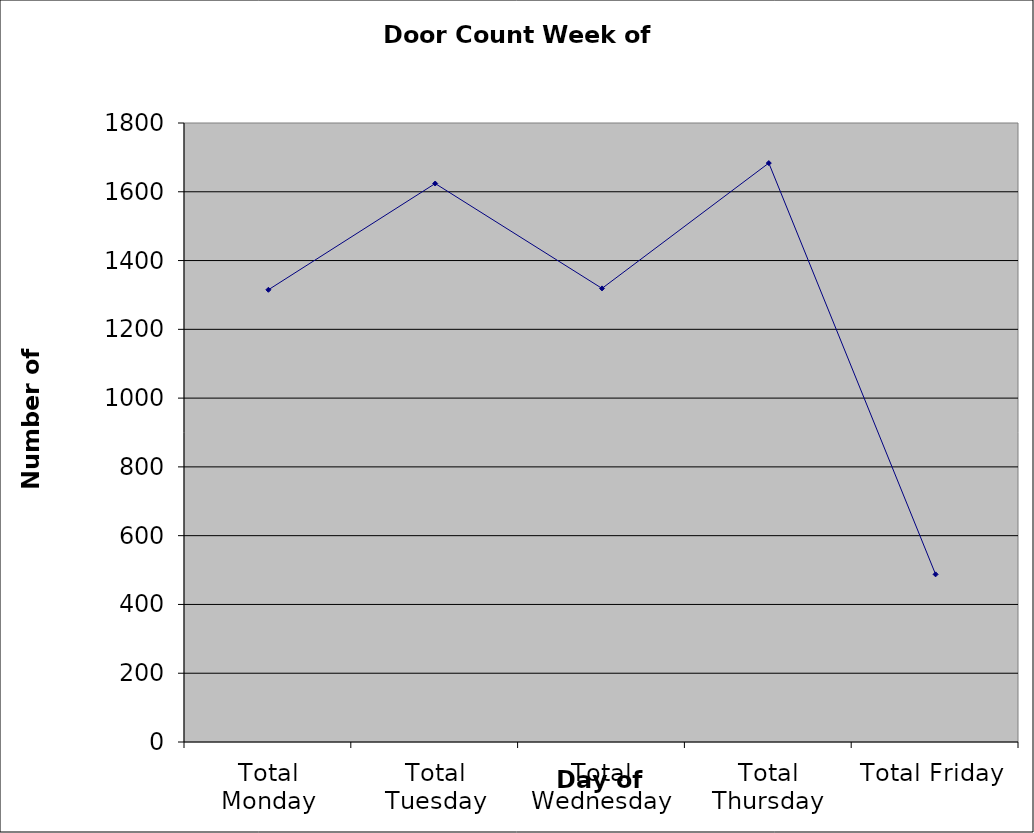
| Category | Series 0 |
|---|---|
| Total Monday | 1315 |
| Total Tuesday | 1624 |
| Total Wednesday | 1319 |
| Total Thursday | 1683.5 |
| Total Friday | 487.5 |